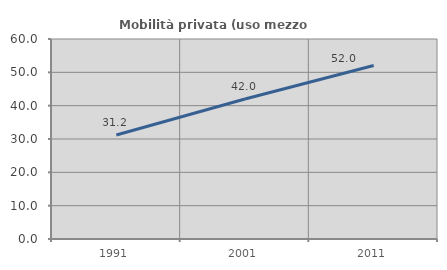
| Category | Mobilità privata (uso mezzo privato) |
|---|---|
| 1991.0 | 31.187 |
| 2001.0 | 42.018 |
| 2011.0 | 52.037 |